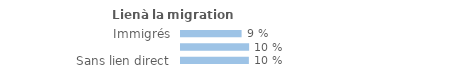
| Category | Series 0 |
|---|---|
| Immigrés | 0.09 |
| Descendants d'immigré(s) | 0.101 |
| Sans lien direct | 0.101 |